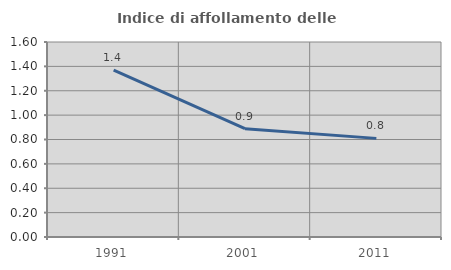
| Category | Indice di affollamento delle abitazioni  |
|---|---|
| 1991.0 | 1.37 |
| 2001.0 | 0.888 |
| 2011.0 | 0.809 |